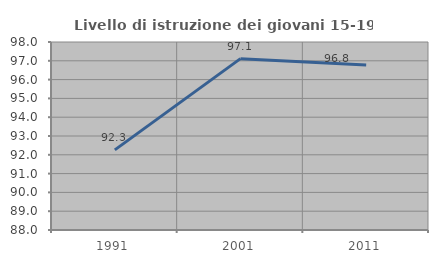
| Category | Livello di istruzione dei giovani 15-19 anni |
|---|---|
| 1991.0 | 92.262 |
| 2001.0 | 97.115 |
| 2011.0 | 96.774 |